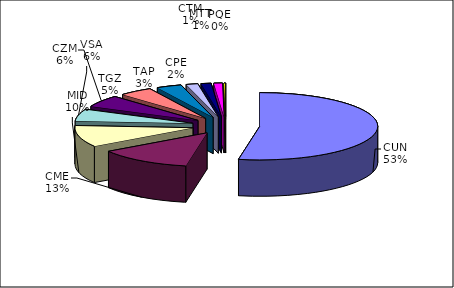
| Category | Series 0 |
|---|---|
| CUN | 174576 |
| CME | 42444 |
| MID | 34026 |
| VSA | 19203 |
| CZM | 18816 |
| TGZ | 15141 |
| TAP | 11379 |
| CPE | 5330 |
| CTM | 4556 |
| MTT | 3895 |
| PQE | 708 |